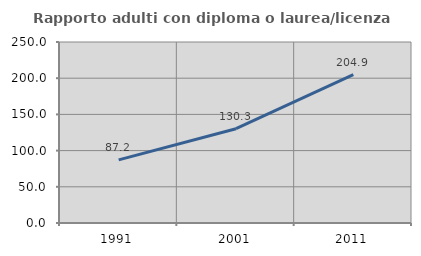
| Category | Rapporto adulti con diploma o laurea/licenza media  |
|---|---|
| 1991.0 | 87.179 |
| 2001.0 | 130.275 |
| 2011.0 | 204.854 |